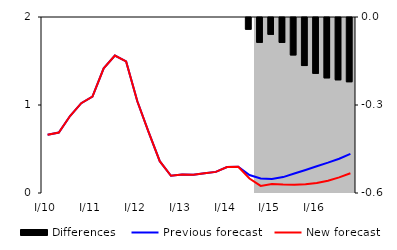
| Category | Differences |
|---|---|
| 0 | 0 |
| 1 | 0 |
| 2 | 0 |
| 3 | 0 |
| 4 | 0 |
| 5 | 0 |
| 6 | 0 |
| 7 | 0 |
| 8 | 0 |
| 9 | 0 |
| 10 | 0 |
| 11 | 0 |
| 12 | 0 |
| 13 | 0 |
| 14 | 0 |
| 15 | 0 |
| 16 | 0 |
| 17 | 0 |
| 18 | -0.04 |
| 19 | -0.085 |
| 20 | -0.057 |
| 21 | -0.085 |
| 22 | -0.128 |
| 23 | -0.164 |
| 24 | -0.19 |
| 25 | -0.206 |
| 26 | -0.212 |
| 27 | -0.219 |